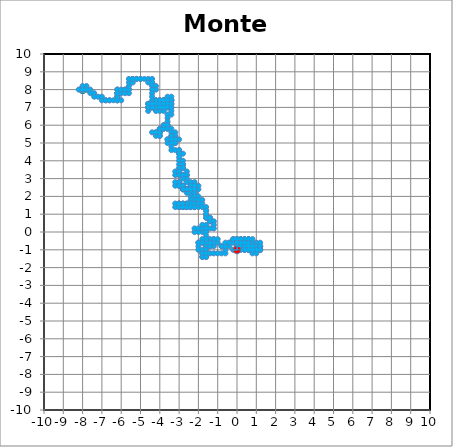
| Category | Monte Carlo |
|---|---|
| -8.0 | 8 |
| -7.8 | 8 |
| -8.0 | 8 |
| -8.2 | 8 |
| -7.999999999999999 | 8 |
| -7.999999999999999 | 8.2 |
| -7.999999999999999 | 8 |
| -7.799999999999999 | 8 |
| -7.799999999999999 | 8.2 |
| -7.799999999999999 | 8 |
| -7.599999999999999 | 8 |
| -7.599999999999999 | 7.8 |
| -7.399999999999999 | 7.8 |
| -7.399999999999999 | 7.6 |
| -7.199999999999998 | 7.6 |
| -6.999999999999998 | 7.6 |
| -6.999999999999998 | 7.4 |
| -6.799999999999998 | 7.4 |
| -6.599999999999998 | 7.4 |
| -6.799999999999998 | 7.4 |
| -6.599999999999998 | 7.4 |
| -6.399999999999998 | 7.4 |
| -6.1999999999999975 | 7.4 |
| -6.1999999999999975 | 7.6 |
| -6.1999999999999975 | 7.4 |
| -5.999999999999997 | 7.4 |
| -6.1999999999999975 | 7.4 |
| -6.1999999999999975 | 7.6 |
| -6.1999999999999975 | 7.8 |
| -6.1999999999999975 | 7.6 |
| -6.1999999999999975 | 7.8 |
| -6.1999999999999975 | 8 |
| -6.1999999999999975 | 7.8 |
| -6.1999999999999975 | 8 |
| -6.1999999999999975 | 7.8 |
| -5.999999999999997 | 7.8 |
| -5.999999999999997 | 8 |
| -5.799999999999997 | 8 |
| -5.599999999999997 | 8 |
| -5.599999999999997 | 7.8 |
| -5.799999999999997 | 7.8 |
| -5.799999999999997 | 8 |
| -5.599999999999997 | 8 |
| -5.599999999999997 | 8.2 |
| -5.599999999999997 | 8.4 |
| -5.399999999999997 | 8.4 |
| -5.399999999999997 | 8.6 |
| -5.599999999999997 | 8.6 |
| -5.399999999999997 | 8.6 |
| -5.199999999999997 | 8.6 |
| -4.9999999999999964 | 8.6 |
| -5.199999999999997 | 8.6 |
| -4.9999999999999964 | 8.6 |
| -4.799999999999996 | 8.6 |
| -4.599999999999996 | 8.6 |
| -4.599999999999996 | 8.4 |
| -4.399999999999996 | 8.4 |
| -4.399999999999996 | 8.6 |
| -4.399999999999996 | 8.4 |
| -4.399999999999996 | 8.2 |
| -4.199999999999996 | 8.2 |
| -4.199999999999996 | 8 |
| -4.399999999999996 | 8 |
| -4.399999999999996 | 7.8 |
| -4.399999999999996 | 7.6 |
| -4.399999999999996 | 7.4 |
| -4.399999999999996 | 7.2 |
| -4.599999999999996 | 7.2 |
| -4.399999999999996 | 7.2 |
| -4.199999999999996 | 7.2 |
| -3.9999999999999956 | 7.2 |
| -3.9999999999999956 | 7 |
| -3.9999999999999956 | 7.2 |
| -4.199999999999996 | 7.2 |
| -4.199999999999996 | 7.4 |
| -3.9999999999999956 | 7.4 |
| -3.7999999999999954 | 7.4 |
| -3.599999999999995 | 7.4 |
| -3.399999999999995 | 7.4 |
| -3.599999999999995 | 7.4 |
| -3.399999999999995 | 7.4 |
| -3.599999999999995 | 7.4 |
| -3.599999999999995 | 7.2 |
| -3.399999999999995 | 7.2 |
| -3.599999999999995 | 7.2 |
| -3.599999999999995 | 7.4 |
| -3.7999999999999954 | 7.4 |
| -3.9999999999999956 | 7.4 |
| -3.7999999999999954 | 7.4 |
| -3.599999999999995 | 7.4 |
| -3.399999999999995 | 7.4 |
| -3.399999999999995 | 7.6 |
| -3.599999999999995 | 7.6 |
| -3.599999999999995 | 7.4 |
| -3.599999999999995 | 7.2 |
| -3.599999999999995 | 7 |
| -3.7999999999999954 | 7 |
| -3.9999999999999956 | 7 |
| -3.9999999999999956 | 7.2 |
| -3.9999999999999956 | 7 |
| -4.199999999999996 | 7 |
| -4.199999999999996 | 6.8 |
| -3.9999999999999956 | 6.8 |
| -3.7999999999999954 | 6.8 |
| -3.7999999999999954 | 7 |
| -3.9999999999999956 | 7 |
| -3.7999999999999954 | 7 |
| -3.9999999999999956 | 7 |
| -4.199999999999996 | 7 |
| -4.399999999999996 | 7 |
| -4.199999999999996 | 7 |
| -4.399999999999996 | 7 |
| -4.599999999999996 | 7 |
| -4.599999999999996 | 6.8 |
| -4.599999999999996 | 7 |
| -4.599999999999996 | 7.2 |
| -4.599999999999996 | 7 |
| -4.399999999999996 | 7 |
| -4.399999999999996 | 7.2 |
| -4.599999999999996 | 7.2 |
| -4.399999999999996 | 7.2 |
| -4.199999999999996 | 7.2 |
| -4.199999999999996 | 7.4 |
| -4.199999999999996 | 7.2 |
| -3.9999999999999956 | 7.2 |
| -3.7999999999999954 | 7.2 |
| -3.599999999999995 | 7.2 |
| -3.7999999999999954 | 7.2 |
| -3.9999999999999956 | 7.2 |
| -3.9999999999999956 | 7.4 |
| -3.7999999999999954 | 7.4 |
| -3.7999999999999954 | 7.2 |
| -3.7999999999999954 | 7 |
| -3.7999999999999954 | 7.2 |
| -3.7999999999999954 | 7 |
| -3.9999999999999956 | 7 |
| -3.7999999999999954 | 7 |
| -3.599999999999995 | 7 |
| -3.399999999999995 | 7 |
| -3.399999999999995 | 7.2 |
| -3.399999999999995 | 7 |
| -3.399999999999995 | 6.8 |
| -3.399999999999995 | 6.6 |
| -3.599999999999995 | 6.6 |
| -3.599999999999995 | 6.4 |
| -3.599999999999995 | 6.2 |
| -3.599999999999995 | 6 |
| -3.7999999999999954 | 6 |
| -3.599999999999995 | 6 |
| -3.599999999999995 | 5.8 |
| -3.7999999999999954 | 5.8 |
| -3.9999999999999956 | 5.8 |
| -3.9999999999999956 | 5.6 |
| -3.9999999999999956 | 5.4 |
| -4.199999999999996 | 5.4 |
| -3.9999999999999956 | 5.4 |
| -3.9999999999999956 | 5.6 |
| -4.199999999999996 | 5.6 |
| -4.399999999999996 | 5.6 |
| -4.199999999999996 | 5.6 |
| -3.9999999999999956 | 5.6 |
| -3.9999999999999956 | 5.8 |
| -3.7999999999999954 | 5.8 |
| -3.7999999999999954 | 6 |
| -3.599999999999995 | 6 |
| -3.599999999999995 | 5.8 |
| -3.399999999999995 | 5.8 |
| -3.399999999999995 | 5.6 |
| -3.199999999999995 | 5.6 |
| -3.199999999999995 | 5.4 |
| -3.199999999999995 | 5.2 |
| -2.9999999999999947 | 5.2 |
| -3.199999999999995 | 5.2 |
| -3.399999999999995 | 5.2 |
| -3.599999999999995 | 5.2 |
| -3.399999999999995 | 5.2 |
| -3.399999999999995 | 5 |
| -3.199999999999995 | 5 |
| -3.399999999999995 | 5 |
| -3.399999999999995 | 5.2 |
| -3.399999999999995 | 5 |
| -3.399999999999995 | 5.2 |
| -3.199999999999995 | 5.2 |
| -3.399999999999995 | 5.2 |
| -3.399999999999995 | 5 |
| -3.599999999999995 | 5 |
| -3.599999999999995 | 5.2 |
| -3.399999999999995 | 5.2 |
| -3.399999999999995 | 5.4 |
| -3.399999999999995 | 5.2 |
| -3.399999999999995 | 5.4 |
| -3.399999999999995 | 5.2 |
| -3.199999999999995 | 5.2 |
| -3.199999999999995 | 5 |
| -3.399999999999995 | 5 |
| -3.399999999999995 | 4.8 |
| -3.399999999999995 | 4.6 |
| -3.199999999999995 | 4.6 |
| -2.9999999999999947 | 4.6 |
| -2.9999999999999947 | 4.4 |
| -2.7999999999999945 | 4.4 |
| -2.9999999999999947 | 4.4 |
| -2.9999999999999947 | 4.6 |
| -2.9999999999999947 | 4.4 |
| -2.9999999999999947 | 4.2 |
| -2.9999999999999947 | 4 |
| -2.7999999999999945 | 4 |
| -2.7999999999999945 | 3.8 |
| -2.7999999999999945 | 3.6 |
| -2.7999999999999945 | 3.8 |
| -2.9999999999999947 | 3.8 |
| -2.7999999999999945 | 3.8 |
| -2.7999999999999945 | 3.6 |
| -2.9999999999999947 | 3.6 |
| -2.9999999999999947 | 3.4 |
| -3.199999999999995 | 3.4 |
| -3.199999999999995 | 3.2 |
| -2.9999999999999947 | 3.2 |
| -2.9999999999999947 | 3.4 |
| -2.9999999999999947 | 3.2 |
| -2.7999999999999945 | 3.2 |
| -2.5999999999999943 | 3.2 |
| -2.5999999999999943 | 3.4 |
| -2.5999999999999943 | 3.2 |
| -2.7999999999999945 | 3.2 |
| -2.7999999999999945 | 3 |
| -2.5999999999999943 | 3 |
| -2.5999999999999943 | 2.8 |
| -2.399999999999994 | 2.8 |
| -2.399999999999994 | 2.6 |
| -2.199999999999994 | 2.6 |
| -2.199999999999994 | 2.4 |
| -2.199999999999994 | 2.2 |
| -2.199999999999994 | 2.4 |
| -1.999999999999994 | 2.4 |
| -1.999999999999994 | 2.6 |
| -2.199999999999994 | 2.6 |
| -2.199999999999994 | 2.8 |
| -2.199999999999994 | 2.6 |
| -2.399999999999994 | 2.6 |
| -2.399999999999994 | 2.4 |
| -2.5999999999999943 | 2.4 |
| -2.7999999999999945 | 2.4 |
| -2.7999999999999945 | 2.6 |
| -2.9999999999999947 | 2.6 |
| -2.7999999999999945 | 2.6 |
| -2.9999999999999947 | 2.6 |
| -2.9999999999999947 | 2.8 |
| -2.9999999999999947 | 2.6 |
| -3.199999999999995 | 2.6 |
| -3.199999999999995 | 2.8 |
| -2.9999999999999947 | 2.8 |
| -2.9999999999999947 | 2.6 |
| -2.7999999999999945 | 2.6 |
| -2.7999999999999945 | 2.4 |
| -2.5999999999999943 | 2.4 |
| -2.399999999999994 | 2.4 |
| -2.399999999999994 | 2.2 |
| -2.5999999999999943 | 2.2 |
| -2.399999999999994 | 2.2 |
| -2.399999999999994 | 2 |
| -2.199999999999994 | 2 |
| -2.199999999999994 | 2.2 |
| -2.199999999999994 | 2.4 |
| -2.399999999999994 | 2.4 |
| -2.5999999999999943 | 2.4 |
| -2.7999999999999945 | 2.4 |
| -2.5999999999999943 | 2.4 |
| -2.7999999999999945 | 2.4 |
| -2.5999999999999943 | 2.4 |
| -2.399999999999994 | 2.4 |
| -2.199999999999994 | 2.4 |
| -2.199999999999994 | 2.6 |
| -2.199999999999994 | 2.4 |
| -2.199999999999994 | 2.2 |
| -2.199999999999994 | 2 |
| -2.199999999999994 | 2.2 |
| -2.199999999999994 | 2 |
| -1.999999999999994 | 2 |
| -1.999999999999994 | 1.8 |
| -1.799999999999994 | 1.8 |
| -1.999999999999994 | 1.8 |
| -2.199999999999994 | 1.8 |
| -2.399999999999994 | 1.8 |
| -2.399999999999994 | 1.6 |
| -2.199999999999994 | 1.6 |
| -2.399999999999994 | 1.6 |
| -2.399999999999994 | 1.4 |
| -2.199999999999994 | 1.4 |
| -2.399999999999994 | 1.4 |
| -2.399999999999994 | 1.6 |
| -2.5999999999999943 | 1.6 |
| -2.5999999999999943 | 1.4 |
| -2.5999999999999943 | 1.6 |
| -2.5999999999999943 | 1.4 |
| -2.7999999999999945 | 1.4 |
| -2.7999999999999945 | 1.6 |
| -2.9999999999999947 | 1.6 |
| -3.199999999999995 | 1.6 |
| -3.199999999999995 | 1.4 |
| -2.9999999999999947 | 1.4 |
| -2.9999999999999947 | 1.6 |
| -2.9999999999999947 | 1.4 |
| -2.7999999999999945 | 1.4 |
| -2.9999999999999947 | 1.4 |
| -2.9999999999999947 | 1.6 |
| -2.7999999999999945 | 1.6 |
| -2.7999999999999945 | 1.4 |
| -2.5999999999999943 | 1.4 |
| -2.399999999999994 | 1.4 |
| -2.199999999999994 | 1.4 |
| -2.199999999999994 | 1.6 |
| -2.199999999999994 | 1.4 |
| -1.999999999999994 | 1.4 |
| -1.999999999999994 | 1.6 |
| -1.799999999999994 | 1.6 |
| -1.799999999999994 | 1.4 |
| -1.599999999999994 | 1.4 |
| -1.599999999999994 | 1.2 |
| -1.599999999999994 | 1 |
| -1.599999999999994 | 0.8 |
| -1.599999999999994 | 1 |
| -1.599999999999994 | 1.2 |
| -1.599999999999994 | 1 |
| -1.599999999999994 | 0.8 |
| -1.3999999999999941 | 0.8 |
| -1.3999999999999941 | 0.6 |
| -1.3999999999999941 | 0.8 |
| -1.3999999999999941 | 0.6 |
| -1.1999999999999942 | 0.6 |
| -1.1999999999999942 | 0.4 |
| -1.1999999999999942 | 0.2 |
| -1.3999999999999941 | 0.2 |
| -1.599999999999994 | 0.2 |
| -1.799999999999994 | 0.2 |
| -1.799999999999994 | 0 |
| -1.999999999999994 | 0 |
| -2.199999999999994 | 0 |
| -2.199999999999994 | 0.2 |
| -1.999999999999994 | 0.2 |
| -1.799999999999994 | 0.2 |
| -1.799999999999994 | 0.4 |
| -1.599999999999994 | 0.4 |
| -1.599999999999994 | 0.2 |
| -1.599999999999994 | 0 |
| -1.599999999999994 | -0.2 |
| -1.599999999999994 | -0.4 |
| -1.599999999999994 | -0.6 |
| -1.599999999999994 | -0.8 |
| -1.3999999999999941 | -0.8 |
| -1.599999999999994 | -0.8 |
| -1.599999999999994 | -0.6 |
| -1.3999999999999941 | -0.6 |
| -1.599999999999994 | -0.6 |
| -1.3999999999999941 | -0.6 |
| -1.1999999999999942 | -0.6 |
| -1.1999999999999942 | -0.4 |
| -1.1999999999999942 | -0.6 |
| -1.1999999999999942 | -0.8 |
| -1.1999999999999942 | -0.6 |
| -0.9999999999999942 | -0.6 |
| -0.9999999999999942 | -0.4 |
| -1.1999999999999942 | -0.4 |
| -1.3999999999999941 | -0.4 |
| -1.3999999999999941 | -0.6 |
| -1.3999999999999941 | -0.8 |
| -1.3999999999999941 | -0.6 |
| -1.599999999999994 | -0.6 |
| -1.3999999999999941 | -0.6 |
| -1.599999999999994 | -0.6 |
| -1.599999999999994 | -0.4 |
| -1.799999999999994 | -0.4 |
| -1.799999999999994 | -0.6 |
| -1.999999999999994 | -0.6 |
| -1.799999999999994 | -0.6 |
| -1.999999999999994 | -0.6 |
| -1.999999999999994 | -0.8 |
| -1.999999999999994 | -1 |
| -1.799999999999994 | -1 |
| -1.599999999999994 | -1 |
| -1.599999999999994 | -1.2 |
| -1.599999999999994 | -1.4 |
| -1.599999999999994 | -1.2 |
| -1.799999999999994 | -1.2 |
| -1.799999999999994 | -1.4 |
| -1.799999999999994 | -1.2 |
| -1.799999999999994 | -1.4 |
| -1.599999999999994 | -1.4 |
| -1.599999999999994 | -1.2 |
| -1.3999999999999941 | -1.2 |
| -1.1999999999999942 | -1.2 |
| -0.9999999999999942 | -1.2 |
| -0.7999999999999943 | -1.2 |
| -0.5999999999999943 | -1.2 |
| -0.5999999999999943 | -1 |
| -0.5999999999999943 | -0.8 |
| -0.7999999999999943 | -0.8 |
| -0.5999999999999943 | -0.8 |
| -0.7999999999999943 | -0.8 |
| -0.5999999999999943 | -0.8 |
| -0.3999999999999943 | -0.8 |
| -0.3999999999999943 | -0.6 |
| -0.5999999999999943 | -0.6 |
| -0.3999999999999943 | -0.6 |
| -0.1999999999999943 | -0.6 |
| -0.1999999999999943 | -0.4 |
| 5.717648576819556e-15 | -0.4 |
| 5.717648576819556e-15 | -0.6 |
| 0.20000000000000573 | -0.6 |
| 0.20000000000000573 | -0.8 |
| 5.717648576819556e-15 | -0.8 |
| 0.20000000000000573 | -0.8 |
| 0.40000000000000574 | -0.8 |
| 0.6000000000000058 | -0.8 |
| 0.8000000000000058 | -0.8 |
| 0.8000000000000058 | -0.6 |
| 1.0000000000000058 | -0.6 |
| 1.0000000000000058 | -0.8 |
| 0.8000000000000058 | -0.8 |
| 1.0000000000000058 | -0.8 |
| 1.0000000000000058 | -1 |
| 1.2000000000000057 | -1 |
| 1.2000000000000057 | -0.8 |
| 1.2000000000000057 | -1 |
| 1.2000000000000057 | -0.8 |
| 1.2000000000000057 | -0.6 |
| 1.2000000000000057 | -0.8 |
| 1.2000000000000057 | -1 |
| 1.0000000000000058 | -1 |
| 1.2000000000000057 | -1 |
| 1.0000000000000058 | -1 |
| 0.8000000000000058 | -1 |
| 0.8000000000000058 | -0.8 |
| 0.6000000000000059 | -0.8 |
| 0.40000000000000585 | -0.8 |
| 0.40000000000000585 | -1 |
| 0.6000000000000059 | -1 |
| 0.40000000000000585 | -1 |
| 0.40000000000000585 | -0.8 |
| 0.6000000000000059 | -0.8 |
| 0.6000000000000059 | -1 |
| 0.8000000000000058 | -1 |
| 0.8000000000000058 | -0.8 |
| 0.8000000000000058 | -0.6 |
| 0.8000000000000058 | -0.8 |
| 0.6000000000000059 | -0.8 |
| 0.6000000000000059 | -0.6 |
| 0.6000000000000059 | -0.4 |
| 0.8000000000000058 | -0.4 |
| 0.6000000000000059 | -0.4 |
| 0.6000000000000059 | -0.6 |
| 0.40000000000000585 | -0.6 |
| 0.40000000000000585 | -0.4 |
| 0.6000000000000059 | -0.4 |
| 0.40000000000000585 | -0.4 |
| 0.20000000000000584 | -0.4 |
| 5.828670879282072e-15 | -0.4 |
| -0.19999999999999418 | -0.4 |
| 5.828670879282072e-15 | -0.4 |
| 0.20000000000000584 | -0.4 |
| 0.20000000000000584 | -0.6 |
| 0.20000000000000584 | -0.8 |
| 0.20000000000000584 | -0.6 |
| 0.20000000000000584 | -0.8 |
| 0.40000000000000585 | -0.8 |
| 0.6000000000000059 | -0.8 |
| 0.8000000000000058 | -0.8 |
| 0.8000000000000058 | -1 |
| 0.8000000000000058 | -1.2 |
| 1.0000000000000058 | -1.2 |
| 1.0000000000000058 | -1 |
| 0.8000000000000058 | -1 |
| 0.6000000000000059 | -1 |
| 0.6000000000000059 | -0.8 |
| 0.40000000000000585 | -0.8 |
| 0.6000000000000059 | -0.8 |
| 0.6000000000000059 | -0.6 |
| 0.6000000000000059 | -0.8 |
| 0.40000000000000585 | -0.8 |
| 0.40000000000000585 | -0.6 |
| 0.20000000000000584 | -0.6 |
| 0.40000000000000585 | -0.6 |
| 0.20000000000000584 | -0.6 |
| 0.20000000000000584 | -0.8 |
| 5.828670879282072e-15 | -0.8 |
| 5.828670879282072e-15 | -1 |
| -0.19999999999999418 | -1 |
| 5.828670879282072e-15 | -1 |
| 5.828670879282072e-15 | -0.8 |
| 5.828670879282072e-15 | -0.6 |
| 0.20000000000000584 | -0.6 |
| 0.40000000000000585 | -0.6 |
| 0.6000000000000059 | -0.6 |
| 0.6000000000000059 | -0.8 |
| 0.8000000000000058 | -0.8 |
| 0.8000000000000058 | -1 |
| 0.6000000000000059 | -1 |
| 0.40000000000000585 | -1 |
| 0.20000000000000584 | -1 |
| 5.828670879282072e-15 | -1 |